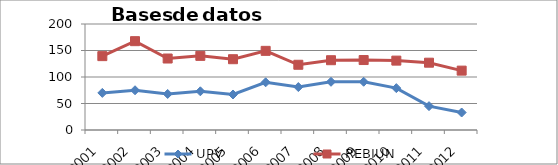
| Category | UPV | REBIUN |
|---|---|---|
| 2001 | 70 | 139.375 |
| 2002 | 75 | 167.625 |
| 2003 | 68 | 134.854 |
| 2004 | 73 | 139.878 |
| 2005 | 67 | 133.571 |
| 2006 | 90 | 149.327 |
| 2007 | 81 | 123.082 |
| 2008 | 91 | 131.673 |
| 2009 | 91 | 132 |
| 2010 | 79 | 130.9 |
| 2011 | 45 | 127 |
| 2012 | 33 | 112 |